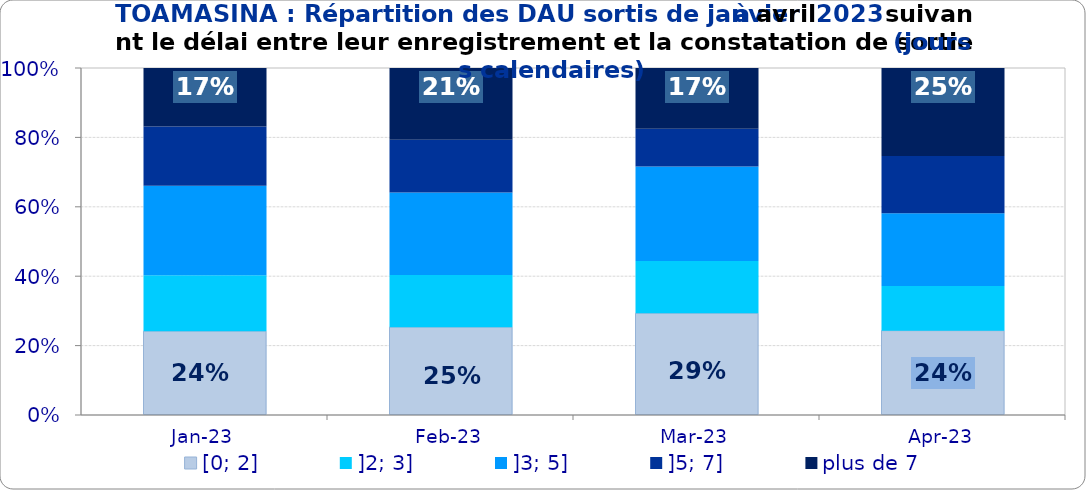
| Category | [0; 2] | ]2; 3] | ]3; 5] | ]5; 7] | plus de 7 |
|---|---|---|---|---|---|
| 2023-01-01 | 0.242 | 0.161 | 0.258 | 0.171 | 0.169 |
| 2023-02-01 | 0.253 | 0.15 | 0.238 | 0.152 | 0.207 |
| 2023-03-01 | 0.293 | 0.151 | 0.272 | 0.109 | 0.175 |
| 2023-04-01 | 0.243 | 0.129 | 0.209 | 0.165 | 0.254 |